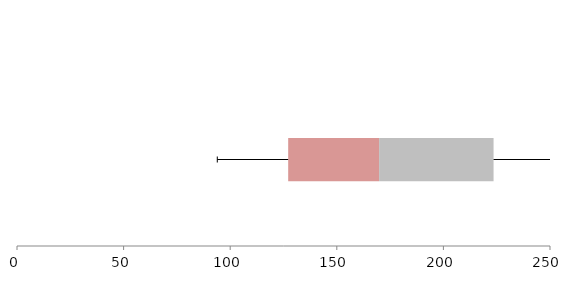
| Category | Series 1 | Series 2 | Series 3 |
|---|---|---|---|
| 0 | 127.198 | 42.644 | 53.687 |